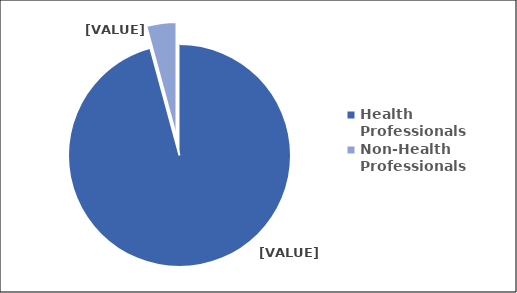
| Category | Series 0 |
|---|---|
| Health Professionals | 95.787 |
| Non-Health Professionals | 4.213 |